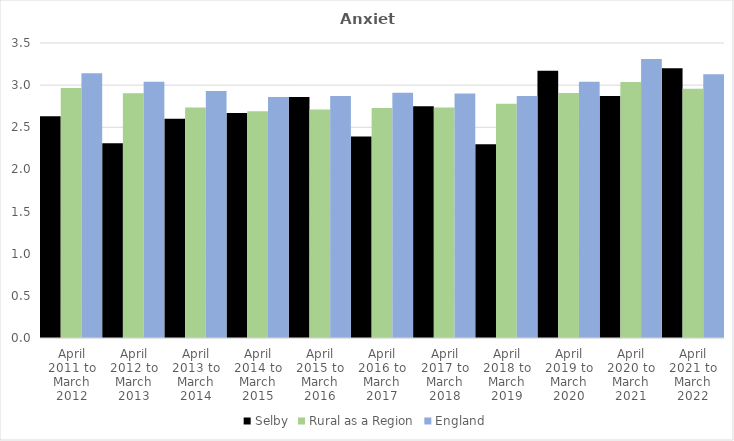
| Category | Selby | Rural as a Region | England |
|---|---|---|---|
| April 2011 to March 2012 | 2.63 | 2.967 | 3.14 |
| April 2012 to March 2013 | 2.31 | 2.904 | 3.04 |
| April 2013 to March 2014 | 2.6 | 2.734 | 2.93 |
| April 2014 to March 2015 | 2.67 | 2.691 | 2.86 |
| April 2015 to March 2016 | 2.86 | 2.711 | 2.87 |
| April 2016 to March 2017 | 2.39 | 2.729 | 2.91 |
| April 2017 to March 2018 | 2.75 | 2.736 | 2.9 |
| April 2018 to March 2019 | 2.3 | 2.78 | 2.87 |
| April 2019 to March 2020 | 3.17 | 2.908 | 3.04 |
| April 2020 to March 2021 | 2.87 | 3.036 | 3.31 |
| April 2021 to March 2022 | 3.2 | 2.956 | 3.13 |